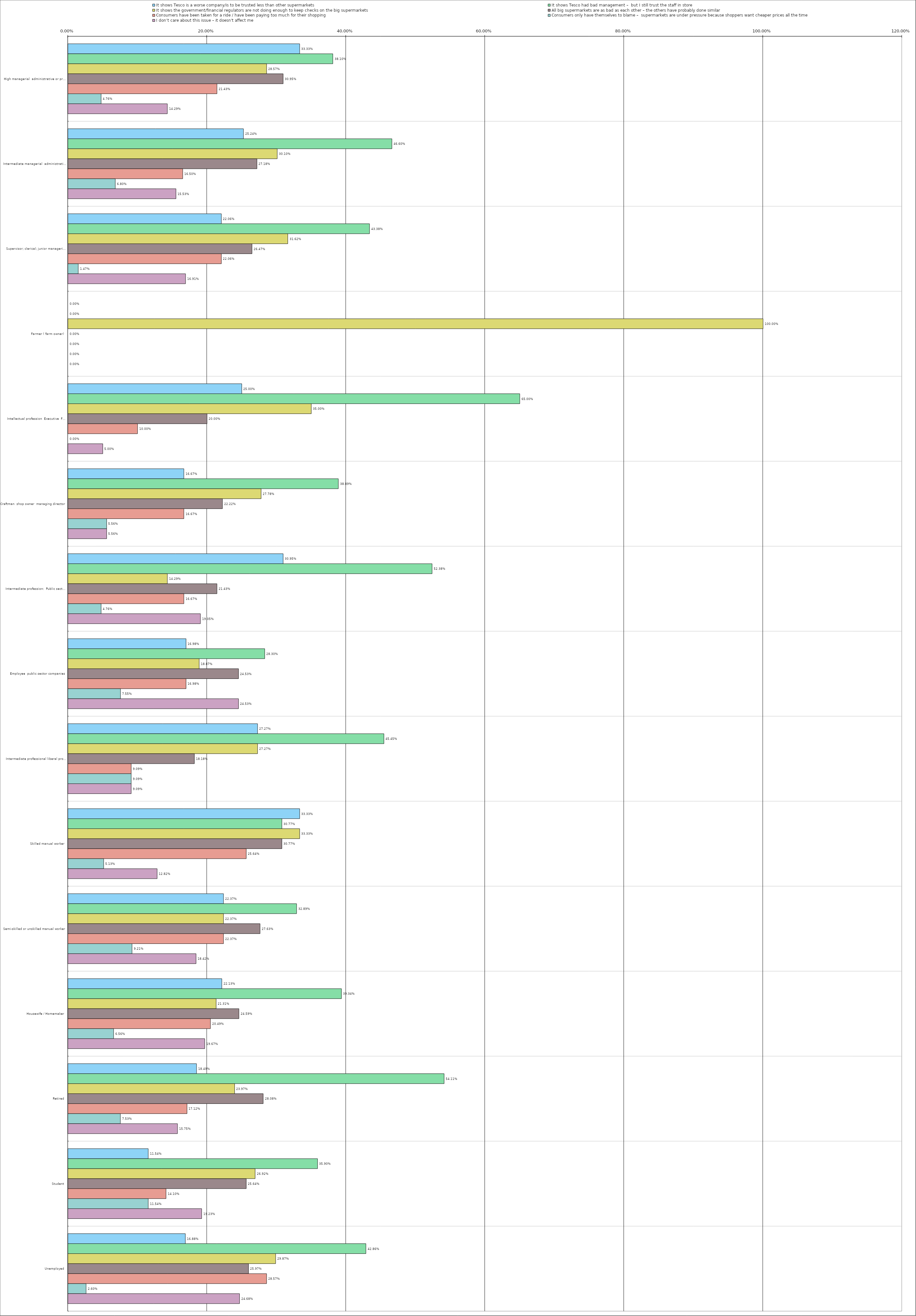
| Category | It shows Tesco is a worse company/is to be trusted less than other supermarkets | It shows Tesco had bad management –  but I still trust the staff in store | It shows the government/financial regulators are not doing enough to keep checks on the big supermarkets | All big supermarkets are as bad as each other – the others have probably done similar | Consumers have been taken for a ride / have been paying too much for their shopping | Consumers only have themselves to blame –  supermarkets are under pressure because shoppers want cheaper prices all the time | I don’t care about this issue – it doesn't affect me |
|---|---|---|---|---|---|---|---|
| 0 | 0.333 | 0.381 | 0.286 | 0.31 | 0.214 | 0.048 | 0.143 |
| 1 | 0.252 | 0.466 | 0.301 | 0.272 | 0.165 | 0.068 | 0.155 |
| 2 | 0.221 | 0.434 | 0.316 | 0.265 | 0.221 | 0.015 | 0.169 |
| 3 | 0 | 0 | 1 | 0 | 0 | 0 | 0 |
| 4 | 0.25 | 0.65 | 0.35 | 0.2 | 0.1 | 0 | 0.05 |
| 5 | 0.167 | 0.389 | 0.278 | 0.222 | 0.167 | 0.056 | 0.056 |
| 6 | 0.31 | 0.524 | 0.143 | 0.214 | 0.167 | 0.048 | 0.19 |
| 7 | 0.17 | 0.283 | 0.189 | 0.245 | 0.17 | 0.076 | 0.245 |
| 8 | 0.273 | 0.454 | 0.273 | 0.182 | 0.091 | 0.091 | 0.091 |
| 9 | 0.333 | 0.308 | 0.333 | 0.308 | 0.256 | 0.051 | 0.128 |
| 10 | 0.224 | 0.329 | 0.224 | 0.276 | 0.224 | 0.092 | 0.184 |
| 11 | 0.221 | 0.393 | 0.213 | 0.246 | 0.205 | 0.066 | 0.197 |
| 12 | 0.185 | 0.541 | 0.24 | 0.281 | 0.171 | 0.075 | 0.158 |
| 13 | 0.115 | 0.359 | 0.269 | 0.256 | 0.141 | 0.115 | 0.192 |
| 14 | 0.169 | 0.429 | 0.299 | 0.26 | 0.286 | 0.026 | 0.247 |